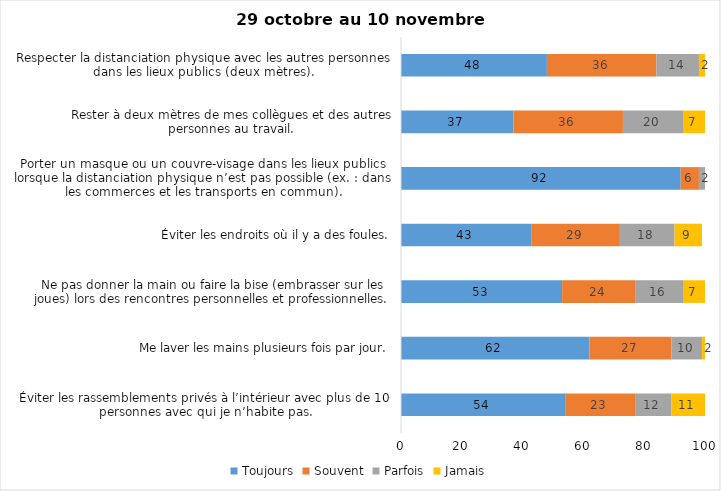
| Category | Toujours | Souvent | Parfois | Jamais |
|---|---|---|---|---|
| Éviter les rassemblements privés à l’intérieur avec plus de 10 personnes avec qui je n’habite pas. | 54 | 23 | 12 | 11 |
| Me laver les mains plusieurs fois par jour. | 62 | 27 | 10 | 2 |
| Ne pas donner la main ou faire la bise (embrasser sur les joues) lors des rencontres personnelles et professionnelles. | 53 | 24 | 16 | 7 |
| Éviter les endroits où il y a des foules. | 43 | 29 | 18 | 9 |
| Porter un masque ou un couvre-visage dans les lieux publics lorsque la distanciation physique n’est pas possible (ex. : dans les commerces et les transports en commun). | 92 | 6 | 2 | 0 |
| Rester à deux mètres de mes collègues et des autres personnes au travail. | 37 | 36 | 20 | 7 |
| Respecter la distanciation physique avec les autres personnes dans les lieux publics (deux mètres). | 48 | 36 | 14 | 2 |